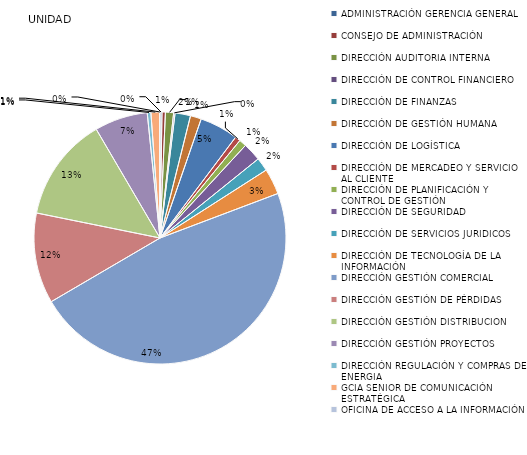
| Category | Series 0 |
|---|---|
| ADMINISTRACIÓN GERENCIA GENERAL | 7 |
| CONSEJO DE ADMINISTRACIÓN | 12 |
| DIRECCIÓN AUDITORIA INTERNA | 29 |
| DIRECCIÓN DE CONTROL FINANCIERO | 5 |
| DIRECCIÓN DE FINANZAS | 55 |
| DIRECCIÓN DE GESTIÓN HUMANA | 39 |
| DIRECCIÓN DE LOGÍSTICA | 137 |
| DIRECCIÓN DE MERCADEO Y SERVICIO AL CLIENTE | 19 |
| DIRECCIÓN DE PLANIFICACIÓN Y CONTROL DE GESTIÓN  | 26 |
| DIRECCIÓN DE SEGURIDAD  | 65 |
| DIRECCIÓN DE SERVICIOS JURIDICOS | 48 |
| DIRECCIÓN DE TECNOLOGÍA DE LA INFORMACIÓN | 92 |
| DIRECCIÓN GESTIÓN COMERCIAL | 1312 |
| DIRECCIÓN GESTIÓN DE PÉRDIDAS | 322 |
| DIRECCIÓN GESTIÓN DISTRIBUCION | 371 |
| DIRECCIÓN GESTIÓN PROYECTOS | 189 |
| DIRECCIÓN REGULACIÓN Y COMPRAS DE ENERGIA | 13 |
| GCIA SENIOR DE COMUNICACIÓN ESTRATÉGICA | 31 |
| OFICINA DE ACCESO A LA INFORMACIÓN | 1 |